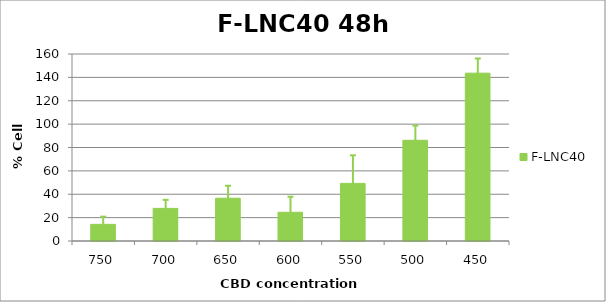
| Category | F-LNC40 |
|---|---|
| 750.0 | 14.241 |
| 700.0 | 27.906 |
| 650.0 | 36.629 |
| 600.0 | 24.583 |
| 550.0 | 49.282 |
| 500.0 | 86.184 |
| 450.0 | 143.618 |